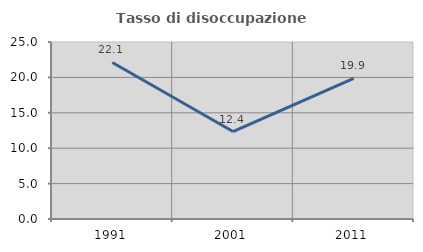
| Category | Tasso di disoccupazione giovanile  |
|---|---|
| 1991.0 | 22.112 |
| 2001.0 | 12.353 |
| 2011.0 | 19.868 |